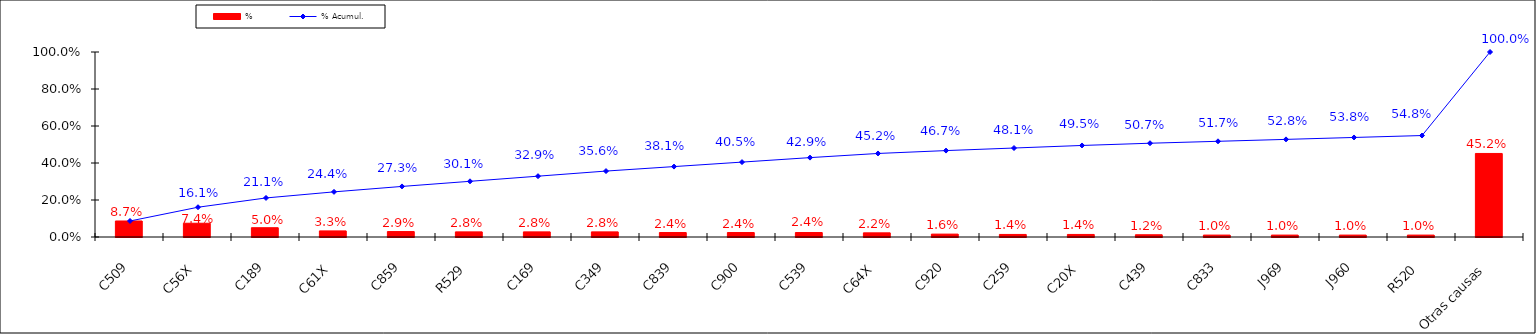
| Category | % |
|---|---|
| C509 | 0.087 |
| C56X | 0.074 |
| C189 | 0.05 |
| C61X | 0.033 |
| C859 | 0.029 |
| R529 | 0.028 |
| C169 | 0.028 |
| C349 | 0.028 |
| C839 | 0.024 |
| C900 | 0.024 |
| C539 | 0.024 |
| C64X | 0.022 |
| C920 | 0.016 |
| C259 | 0.014 |
| C20X | 0.014 |
| C439 | 0.012 |
| C833 | 0.01 |
| J969 | 0.01 |
| J960 | 0.01 |
| R520 | 0.01 |
| Otras causas | 0.452 |